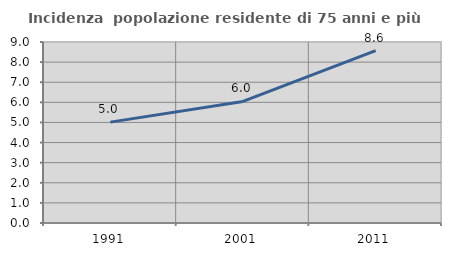
| Category | Incidenza  popolazione residente di 75 anni e più |
|---|---|
| 1991.0 | 5.015 |
| 2001.0 | 6.046 |
| 2011.0 | 8.569 |